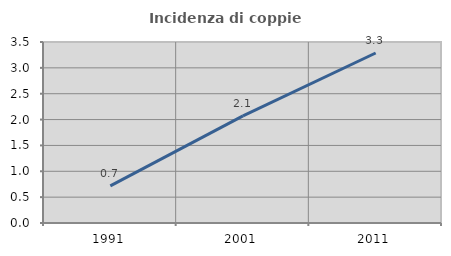
| Category | Incidenza di coppie miste |
|---|---|
| 1991.0 | 0.717 |
| 2001.0 | 2.071 |
| 2011.0 | 3.288 |